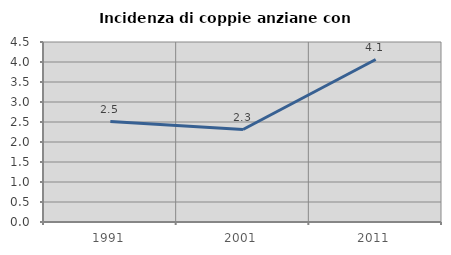
| Category | Incidenza di coppie anziane con figli |
|---|---|
| 1991.0 | 2.51 |
| 2001.0 | 2.312 |
| 2011.0 | 4.062 |